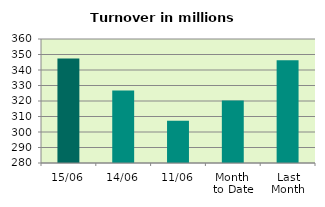
| Category | Series 0 |
|---|---|
| 15/06 | 347.394 |
| 14/06 | 326.818 |
| 11/06 | 307.282 |
| Month 
to Date | 320.401 |
| Last
Month | 346.329 |